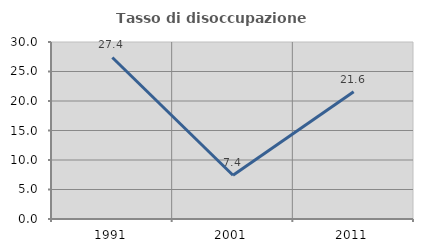
| Category | Tasso di disoccupazione giovanile  |
|---|---|
| 1991.0 | 27.381 |
| 2001.0 | 7.407 |
| 2011.0 | 21.569 |